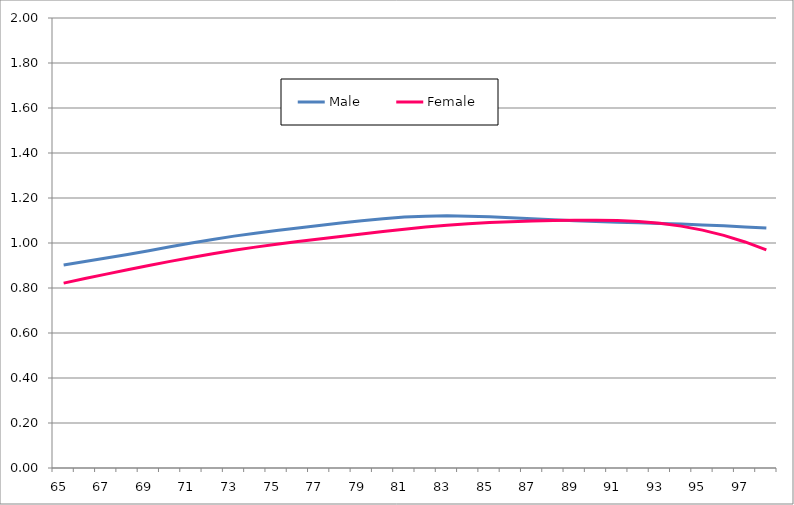
| Category | Male | Female |
|---|---|---|
| 65.0 | 0.902 | 0.822 |
| 66.0 | 0.917 | 0.842 |
| 67.0 | 0.933 | 0.862 |
| 68.0 | 0.949 | 0.881 |
| 69.0 | 0.966 | 0.9 |
| 70.0 | 0.983 | 0.918 |
| 71.0 | 1 | 0.936 |
| 72.0 | 1.016 | 0.952 |
| 73.0 | 1.03 | 0.968 |
| 74.0 | 1.044 | 0.982 |
| 75.0 | 1.056 | 0.995 |
| 76.0 | 1.067 | 1.007 |
| 77.0 | 1.078 | 1.018 |
| 78.0 | 1.089 | 1.029 |
| 79.0 | 1.099 | 1.04 |
| 80.0 | 1.108 | 1.051 |
| 81.0 | 1.115 | 1.062 |
| 82.0 | 1.119 | 1.071 |
| 83.0 | 1.121 | 1.079 |
| 84.0 | 1.119 | 1.085 |
| 85.0 | 1.116 | 1.091 |
| 86.0 | 1.112 | 1.095 |
| 87.0 | 1.108 | 1.097 |
| 88.0 | 1.103 | 1.1 |
| 89.0 | 1.099 | 1.101 |
| 90.0 | 1.096 | 1.102 |
| 91.0 | 1.093 | 1.1 |
| 92.0 | 1.09 | 1.096 |
| 93.0 | 1.087 | 1.088 |
| 94.0 | 1.084 | 1.075 |
| 95.0 | 1.08 | 1.057 |
| 96.0 | 1.076 | 1.034 |
| 97.0 | 1.072 | 1.005 |
| 98.0 | 1.066 | 0.969 |